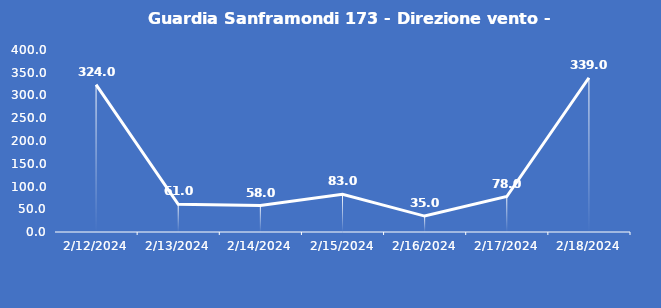
| Category | Guardia Sanframondi 173 - Direzione vento - Grezzo (°N) |
|---|---|
| 2/12/24 | 324 |
| 2/13/24 | 61 |
| 2/14/24 | 58 |
| 2/15/24 | 83 |
| 2/16/24 | 35 |
| 2/17/24 | 78 |
| 2/18/24 | 339 |